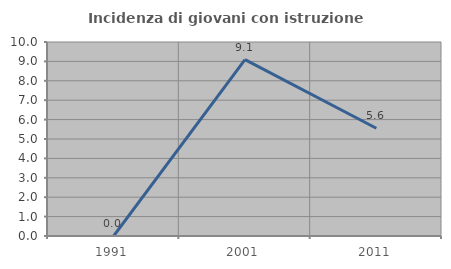
| Category | Incidenza di giovani con istruzione universitaria |
|---|---|
| 1991.0 | 0 |
| 2001.0 | 9.091 |
| 2011.0 | 5.556 |